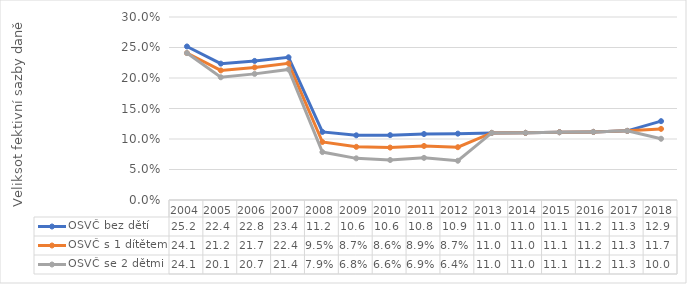
| Category | OSVČ bez dětí | OSVČ s 1 dítětem | OSVČ se 2 dětmi |
|---|---|---|---|
| 2004.0 | 0.252 | 0.241 | 0.241 |
| 2005.0 | 0.224 | 0.212 | 0.201 |
| 2006.0 | 0.228 | 0.217 | 0.207 |
| 2007.0 | 0.234 | 0.224 | 0.214 |
| 2008.0 | 0.112 | 0.095 | 0.079 |
| 2009.0 | 0.106 | 0.087 | 0.068 |
| 2010.0 | 0.106 | 0.086 | 0.066 |
| 2011.0 | 0.108 | 0.089 | 0.069 |
| 2012.0 | 0.109 | 0.087 | 0.064 |
| 2013.0 | 0.11 | 0.11 | 0.11 |
| 2014.0 | 0.11 | 0.11 | 0.11 |
| 2015.0 | 0.111 | 0.111 | 0.111 |
| 2016.0 | 0.112 | 0.112 | 0.112 |
| 2017.0 | 0.113 | 0.113 | 0.113 |
| 2018.0 | 0.129 | 0.117 | 0.1 |